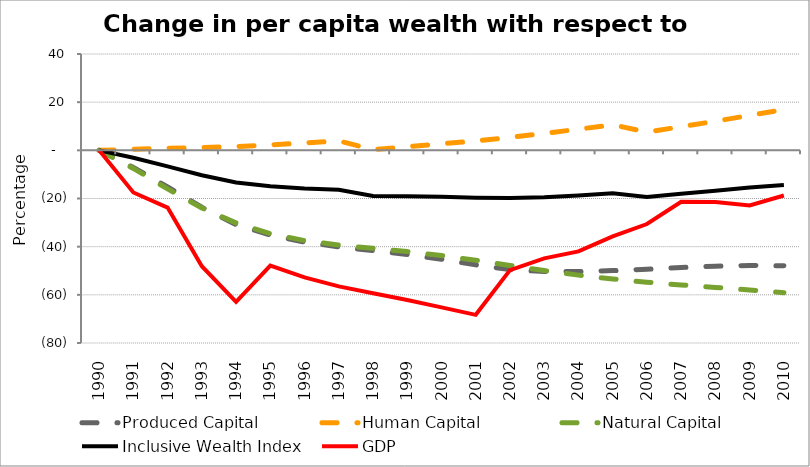
| Category | Produced Capital  | Human Capital | Natural Capital | Inclusive Wealth Index | GDP |
|---|---|---|---|---|---|
| 1990.0 | 0 | 0 | 0 | 0 | 0 |
| 1991.0 | -7.12 | 0.424 | -7.517 | -3.108 | -17.5 |
| 1992.0 | -15.23 | 0.834 | -16.015 | -6.68 | -23.765 |
| 1993.0 | -23.639 | 1.155 | -23.909 | -10.335 | -48.101 |
| 1994.0 | -30.804 | 1.558 | -30.161 | -13.324 | -62.917 |
| 1995.0 | -35.146 | 2.284 | -34.588 | -14.95 | -47.873 |
| 1996.0 | -38.085 | 3.052 | -37.488 | -15.891 | -52.757 |
| 1997.0 | -40.097 | 3.904 | -39.36 | -16.346 | -56.479 |
| 1998.0 | -41.64 | 0.304 | -40.691 | -18.971 | -59.319 |
| 1999.0 | -43.249 | 1.459 | -42.026 | -19.062 | -62.121 |
| 2000.0 | -45.239 | 2.709 | -43.686 | -19.271 | -65.19 |
| 2001.0 | -47.545 | 3.878 | -45.654 | -19.669 | -68.305 |
| 2002.0 | -49.523 | 5.357 | -47.79 | -19.806 | -49.746 |
| 2003.0 | -50.31 | 7.018 | -49.91 | -19.43 | -44.875 |
| 2004.0 | -50.335 | 8.773 | -51.822 | -18.715 | -41.965 |
| 2005.0 | -49.946 | 10.605 | -53.436 | -17.782 | -35.758 |
| 2006.0 | -49.409 | 7.597 | -54.764 | -19.366 | -30.598 |
| 2007.0 | -48.625 | 9.791 | -55.899 | -18.046 | -21.375 |
| 2008.0 | -48.124 | 12.096 | -56.938 | -16.752 | -21.45 |
| 2009.0 | -47.792 | 14.496 | -57.985 | -15.467 | -22.88 |
| 2010.0 | -47.956 | 16.91 | -59.128 | -14.358 | -18.751 |